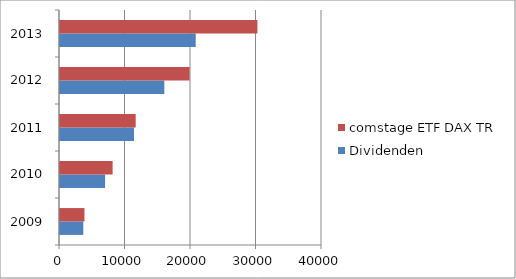
| Category | Dividenden | comstage ETF DAX TR |
|---|---|---|
| 2009.0 | 3556.87 | 3735.28 |
| 2010.0 | 6883 | 8036.21 |
| 2011.0 | 11300.91 | 11556.61 |
| 2012.0 | 15927.83 | 19786.47 |
| 2013.0 | 20720.73 | 30140.8 |